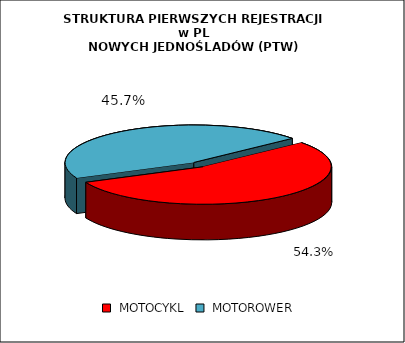
| Category | RAZEM |
|---|---|
|  MOTOCYKL  | 0.543 |
|  MOTOROWER  | 0.457 |